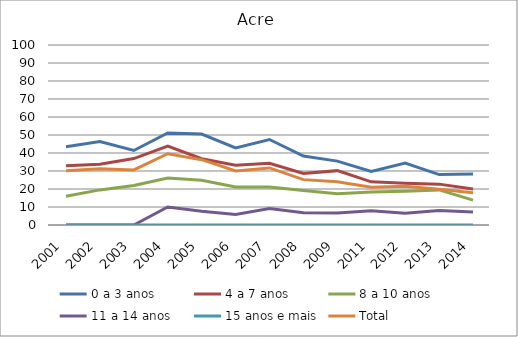
| Category | 0 a 3 anos | 4 a 7 anos | 8 a 10 anos | 11 a 14 anos | 15 anos e mais | Total |
|---|---|---|---|---|---|---|
| 2001.0 | 43.5 | 32.9 | 16 | 0 | 0 | 30.1 |
| 2002.0 | 46.4 | 33.8 | 19.5 | 0 | 0 | 31.2 |
| 2003.0 | 41.4 | 36.9 | 21.9 | 0 | 0 | 30.6 |
| 2004.0 | 51.1 | 43.8 | 26.1 | 10 | 0 | 39.6 |
| 2005.0 | 50.5 | 36.8 | 24.9 | 7.7 | 0 | 36.3 |
| 2006.0 | 42.8 | 33.2 | 21.1 | 5.9 | 0 | 30 |
| 2007.0 | 47.5 | 34.3 | 21.1 | 9.1 | 0 | 31.7 |
| 2008.0 | 38.3 | 28.6 | 19.2 | 6.8 | 0 | 25.2 |
| 2009.0 | 35.5 | 30.2 | 17.4 | 6.6 | 0 | 24 |
| 2011.0 | 29.7 | 24 | 18.3 | 7.9 | 0 | 21 |
| 2012.0 | 34.4 | 23.2 | 18.8 | 6.5 | 0 | 21.5 |
| 2013.0 | 28 | 22.7 | 19.5 | 8 | 0 | 19.9 |
| 2014.0 | 28.3 | 20 | 13.8 | 7.2 | 0 | 17.9 |